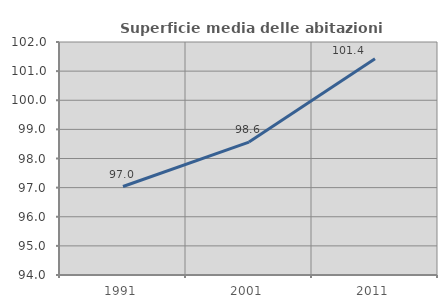
| Category | Superficie media delle abitazioni occupate |
|---|---|
| 1991.0 | 97.038 |
| 2001.0 | 98.565 |
| 2011.0 | 101.425 |